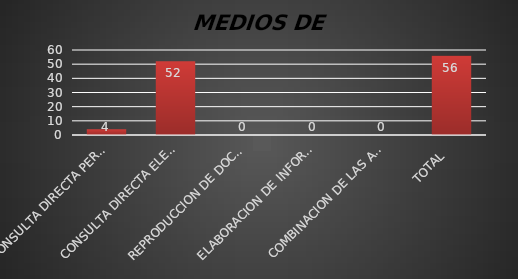
| Category | Series 1 |
|---|---|
| CONSULTA DIRECTA PERSONAL | 4 |
| CONSULTA DIRECTA ELECTRONICA | 52 |
| REPRODUCCION DE DOCUMENTOS  | 0 |
| ELABORACION DE INFORMES ESPECIFICOS  | 0 |
| COMBINACION DE LAS ANTERIORES | 0 |
| TOTAL  | 56 |